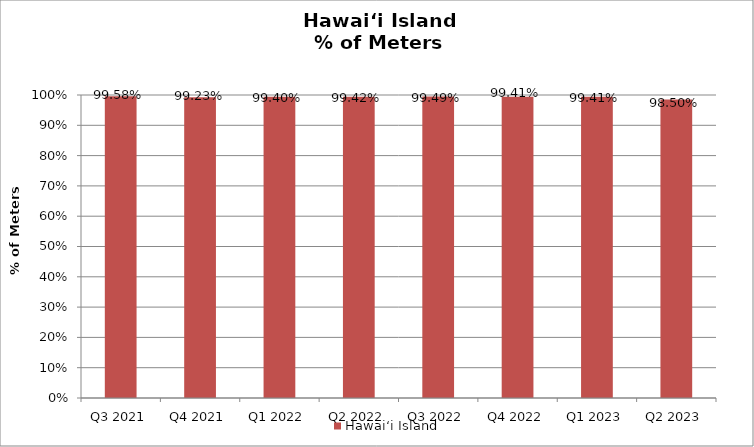
| Category | Hawai‘i Island |
|---|---|
| Q3 2021 | 0.996 |
| Q4 2021 | 0.992 |
| Q1 2022 | 0.994 |
| Q2 2022 | 0.994 |
| Q3 2022 | 0.995 |
| Q4 2022 | 0.994 |
| Q1 2023 | 0.994 |
| Q2 2023 | 0.985 |